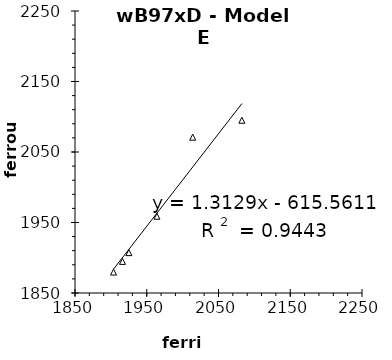
| Category | Series 0 |
|---|---|
| 1903.716397849462 | 1879.692 |
| 1916.173387096774 | 1894.819 |
| 1925.07123655914 | 1907.276 |
| 1964.221774193548 | 1958.883 |
| 2014.049731182796 | 2070.996 |
| 2082.563172043011 | 2095.02 |